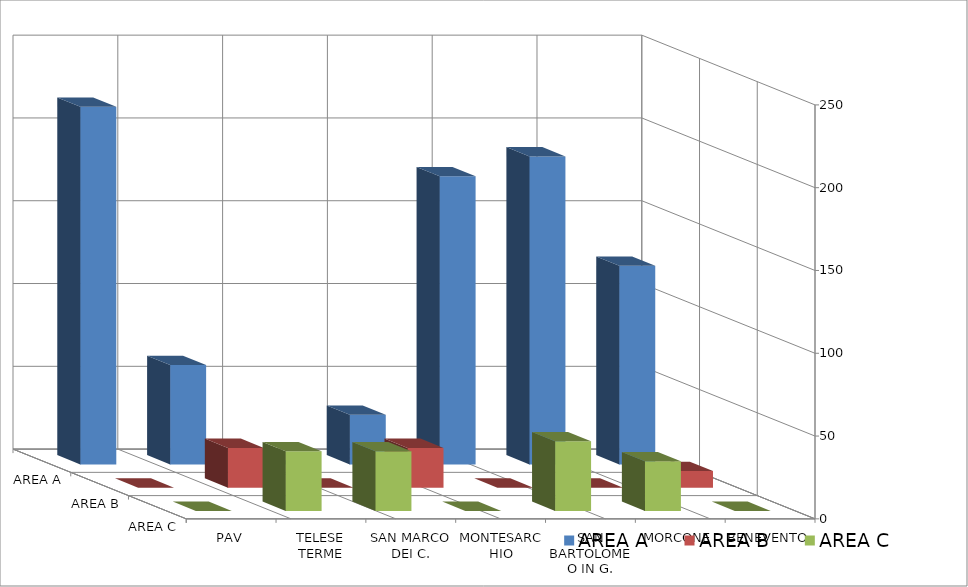
| Category | AREA A | AREA B | AREA C |
|---|---|---|---|
| BENEVENTO | 120 | 10 | 0 |
| MORCONE | 186 | 0 | 30 |
| SAN BARTOLOMEO IN G. | 174 | 0 | 42 |
| MONTESARCHIO | 30 | 24 | 0 |
| SAN MARCO DEI C. | 0 | 0 | 36 |
| TELESE TERME | 60 | 24 | 36 |
| PAV | 216 | 0 | 0 |